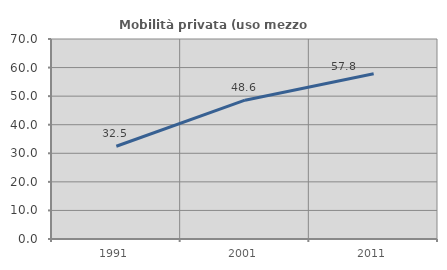
| Category | Mobilità privata (uso mezzo privato) |
|---|---|
| 1991.0 | 32.453 |
| 2001.0 | 48.592 |
| 2011.0 | 57.841 |